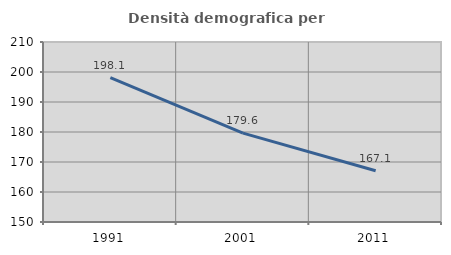
| Category | Densità demografica |
|---|---|
| 1991.0 | 198.113 |
| 2001.0 | 179.635 |
| 2011.0 | 167.077 |